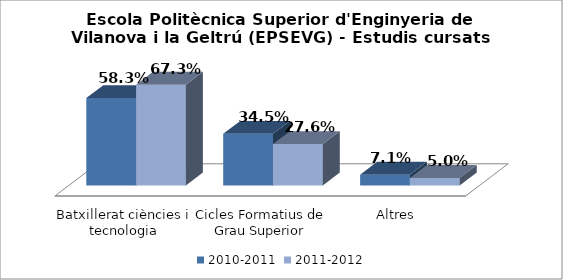
| Category | 2010-2011 | 2011-2012 |
|---|---|---|
| Batxillerat ciències i tecnologia | 0.583 | 0.673 |
| Cicles Formatius de Grau Superior | 0.345 | 0.276 |
| Altres | 0.071 | 0.05 |